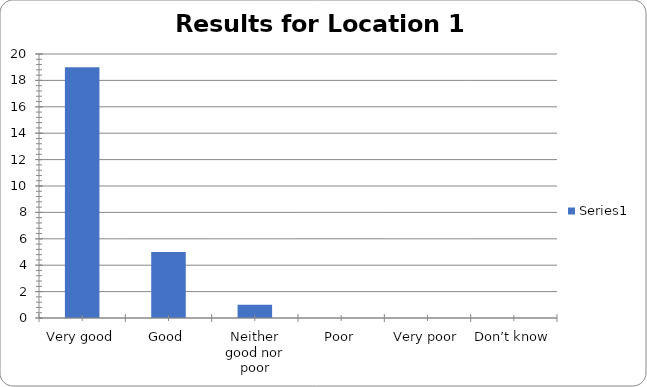
| Category | Series 0 |
|---|---|
| Very good | 19 |
| Good | 5 |
| Neither good nor poor | 1 |
| Poor | 0 |
| Very poor | 0 |
| Don’t know | 0 |